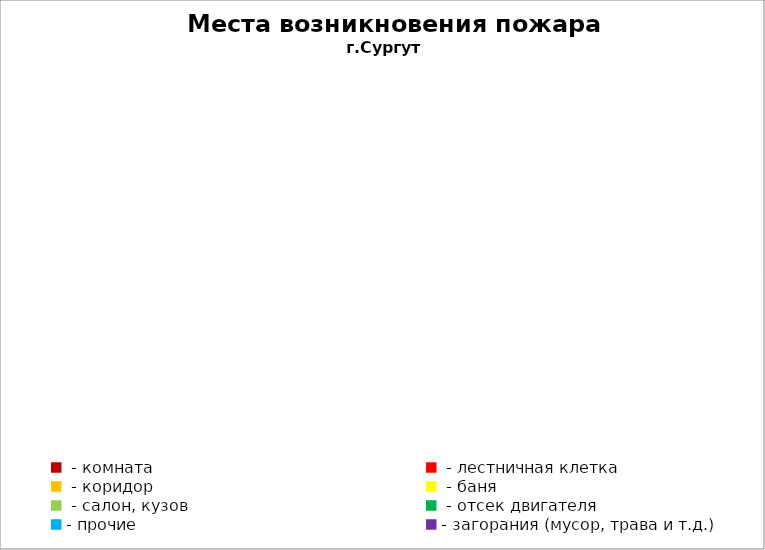
| Category | Места возникновения пожара |
|---|---|
|  - комната | 19 |
|  - лестничная клетка | 2 |
|  - коридор | 5 |
|  - баня | 11 |
|  - салон, кузов | 0 |
|  - отсек двигателя | 22 |
| - прочие | 27 |
| - загорания (мусор, трава и т.д.)  | 26 |